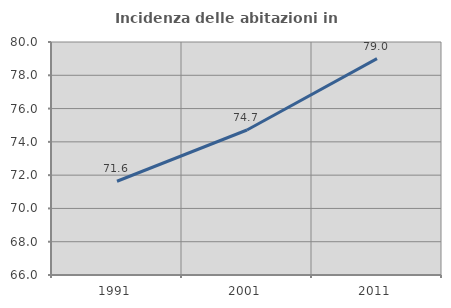
| Category | Incidenza delle abitazioni in proprietà  |
|---|---|
| 1991.0 | 71.632 |
| 2001.0 | 74.713 |
| 2011.0 | 79.004 |